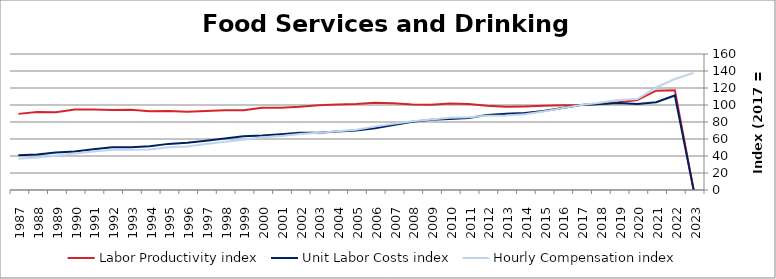
| Category | Labor Productivity index | Unit Labor Costs index | Hourly Compensation index |
|---|---|---|---|
| 2023.0 | 0 | 0 | 137.695 |
| 2022.0 | 117.424 | 111.241 | 130.623 |
| 2021.0 | 116.854 | 103.193 | 120.585 |
| 2020.0 | 105.749 | 101.25 | 107.07 |
| 2019.0 | 103.276 | 102.442 | 105.797 |
| 2018.0 | 101.312 | 101.242 | 102.571 |
| 2017.0 | 100 | 100 | 100 |
| 2016.0 | 99.795 | 96.516 | 96.318 |
| 2015.0 | 99.177 | 93.014 | 92.249 |
| 2014.0 | 98.282 | 90.621 | 89.064 |
| 2013.0 | 97.819 | 89.717 | 87.76 |
| 2012.0 | 99.055 | 88.111 | 87.278 |
| 2011.0 | 101.114 | 84.789 | 85.734 |
| 2010.0 | 101.701 | 83.67 | 85.093 |
| 2009.0 | 100.352 | 82.566 | 82.856 |
| 2008.0 | 100.686 | 80.326 | 80.877 |
| 2007.0 | 101.925 | 76.51 | 77.983 |
| 2006.0 | 102.505 | 72.731 | 74.553 |
| 2005.0 | 101.259 | 70.087 | 70.969 |
| 2004.0 | 100.558 | 68.832 | 69.217 |
| 2003.0 | 99.774 | 67.361 | 67.208 |
| 2002.0 | 97.924 | 67.374 | 65.976 |
| 2001.0 | 96.77 | 65.712 | 63.59 |
| 2000.0 | 96.757 | 64.032 | 61.955 |
| 1999.0 | 93.847 | 63.131 | 59.247 |
| 1998.0 | 93.965 | 60.522 | 56.869 |
| 1997.0 | 93.082 | 58.044 | 54.029 |
| 1996.0 | 92.084 | 55.728 | 51.317 |
| 1995.0 | 92.927 | 54.26 | 50.422 |
| 1994.0 | 92.749 | 51.419 | 47.69 |
| 1993.0 | 94.336 | 50.31 | 47.46 |
| 1992.0 | 94.05 | 50.195 | 47.208 |
| 1991.0 | 94.585 | 47.84 | 45.249 |
| 1990.0 | 94.788 | 45.411 | 43.045 |
| 1989.0 | 91.596 | 43.991 | 40.294 |
| 1988.0 | 91.693 | 41.754 | 38.285 |
| 1987.0 | 89.563 | 40.898 | 36.63 |